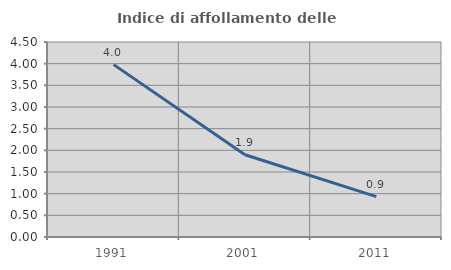
| Category | Indice di affollamento delle abitazioni  |
|---|---|
| 1991.0 | 3.978 |
| 2001.0 | 1.899 |
| 2011.0 | 0.932 |